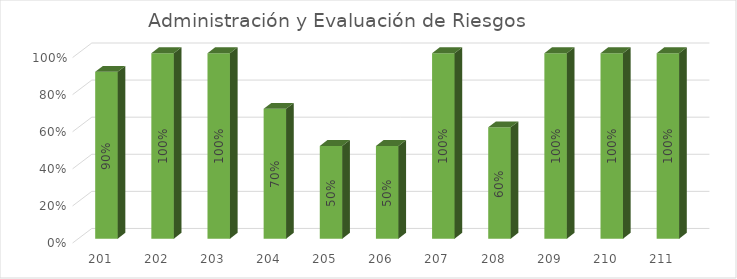
| Category | % Avance |
|---|---|
| 201.0 | 0.9 |
| 202.0 | 1 |
| 203.0 | 1 |
| 204.0 | 0.7 |
| 205.0 | 0.5 |
| 206.0 | 0.5 |
| 207.0 | 1 |
| 208.0 | 0.6 |
| 209.0 | 1 |
| 210.0 | 1 |
| 211.0 | 1 |